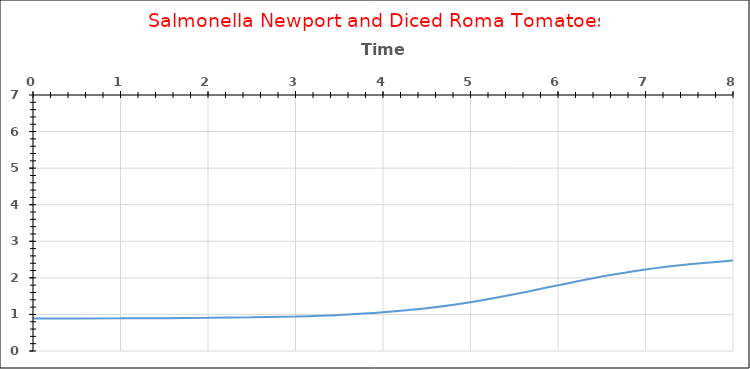
| Category | 22 |
|---|---|
| 0.0 | 0.887 |
| 0.5 | 0.889 |
| 1.0 | 0.892 |
| 1.5 | 0.897 |
| 2.0 | 0.906 |
| 2.5 | 0.921 |
| 3.0 | 0.945 |
| 3.5 | 0.987 |
| 4.0 | 1.057 |
| 4.5 | 1.168 |
| 5.0 | 1.332 |
| 5.5 | 1.549 |
| 6.0 | 1.797 |
| 6.5 | 2.036 |
| 7.0 | 2.231 |
| 7.5 | 2.374 |
| 8.0 | 2.476 |